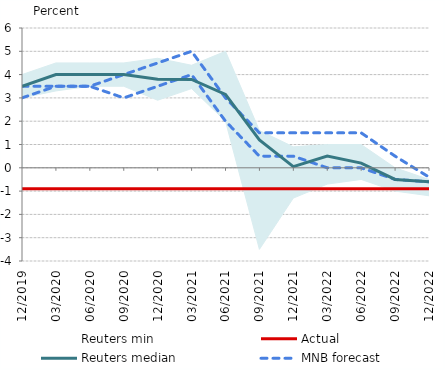
| Category | MNB forecast | Reuters median | Actual |
|---|---|---|---|
| 2020-12-01 | 3.5 | 3.5 | -0.9 |
| 2021-03-01 | 3.5 | 4 | -0.9 |
| 2021-06-01 | 3.5 | 4 | -0.9 |
| 2021-09-01 | 4 | 4 | -0.9 |
| 2021-12-01 | 4.5 | 3.8 | -0.9 |
| 2022-03-01 | 5 | 3.79 | -0.9 |
| 2022-06-01 | 3 | 3.15 | -0.9 |
| 2022-09-01 | 1.5 | 1.2 | -0.9 |
| 2022-12-01 | 1.5 | 0.05 | -0.9 |
| 2023-03-01 | 1.5 | 0.5 | -0.9 |
| 2023-06-01 | 1.5 | 0.2 | -0.9 |
| 2023-09-01 | 0.5 | -0.5 | -0.9 |
| 2023-12-01 | -0.4 | -0.6 | -0.9 |